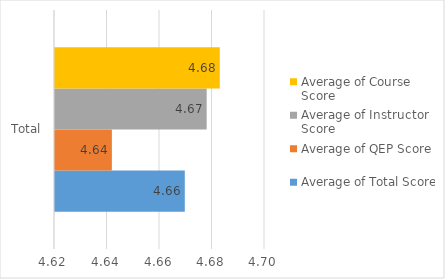
| Category | Average of Total Score | Average of QEP Score | Average of Instructor Score | Average of Course Score |
|---|---|---|---|---|
| Total | 4.664 | 4.637 | 4.673 | 4.678 |